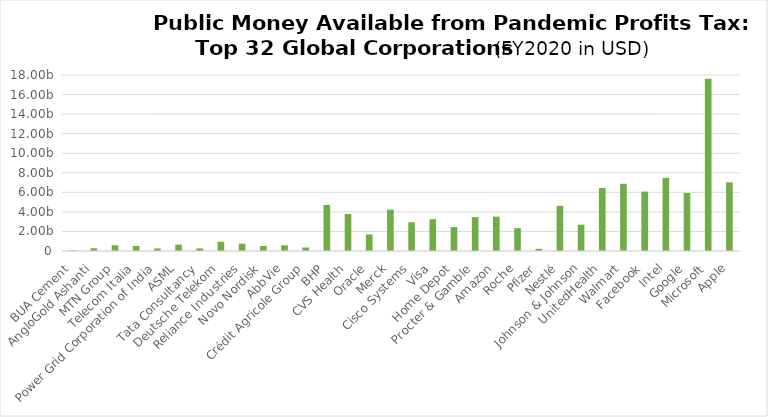
| Category | Excess profit tax liability |
|---|---|
| BUA Cement | 53011583.333 |
| AngloGold Ashanti | 281829375 |
| MTN Group | 585257000 |
| Telecom Italia | 513368125 |
| Power Grid Corporation of India | 260179046 |
| ASML | 653797125 |
| Tata Consultancy | 263986000 |
| Deutsche Telekom | 940182937.5 |
| Reliance Industries | 749029875 |
| Novo Nordisk | 514417875 |
| AbbVie | 582423625 |
| Crédit Agricole Group | 360377750 |
| BHP | 4710812500 |
| CVS Health | 3789538125 |
| Oracle | 1689043000 |
| Merck | 4229079375 |
| Cisco Systems | 2933103625 |
| Visa | 3253405625 |
| Home Depot | 2447556250 |
| Procter & Gamble | 3467749375 |
| Amazon | 3517415375 |
| Roche | 2340511437.5 |
| Pfizer | 225142875 |
| Nestlé | 4620058762.5 |
| Johnson & Johnson | 2693022000 |
| UnitedHealth | 6450975000 |
| Walmart | 6876681875 |
| Facebook | 6076380500 |
| Intel | 7480342750 |
| Google | 5934467125 |
| Microsoft | 17625081625 |
| Apple | 7027475375 |